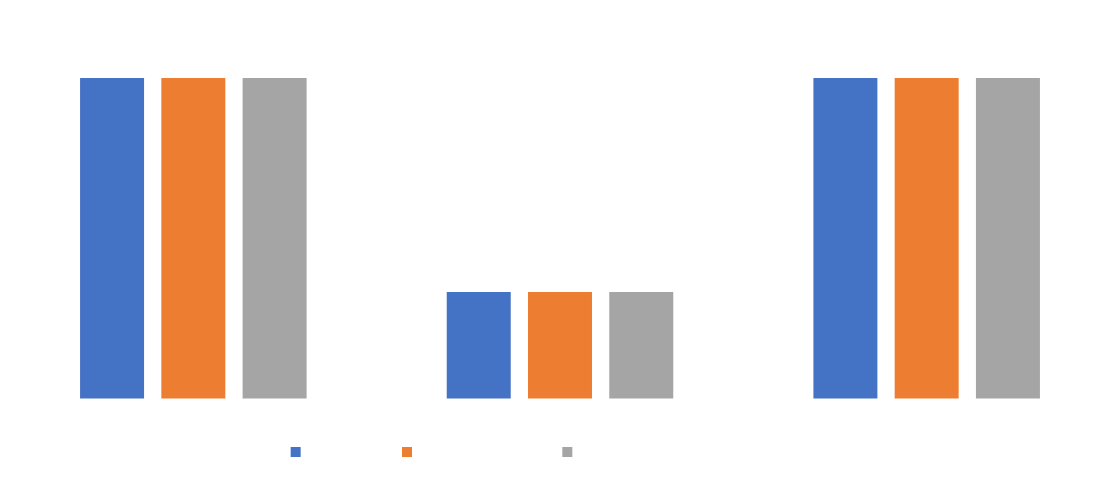
| Category | Students | Teaching staff | Professional services staff |
|---|---|---|---|
| Good or above | 0.429 | 0.429 | 0.429 |
| Average | 0.143 | 0.143 | 0.143 |
| Poor or below | 0.429 | 0.429 | 0.429 |